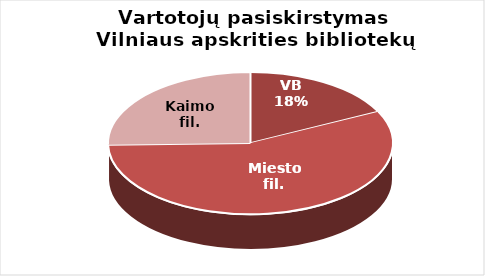
| Category | Series 0 |
|---|---|
| VB | 19803 |
| Miesto fil. | 63641 |
| Kaimo fil. | 28357 |